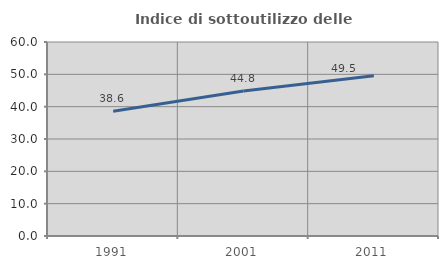
| Category | Indice di sottoutilizzo delle abitazioni  |
|---|---|
| 1991.0 | 38.561 |
| 2001.0 | 44.821 |
| 2011.0 | 49.548 |